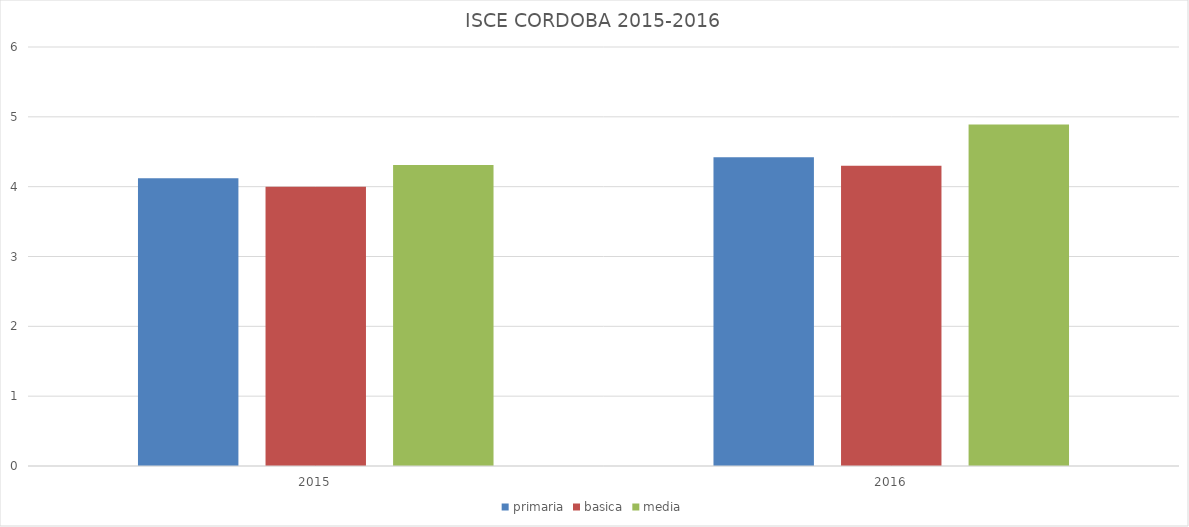
| Category | primaria | basica | media |
|---|---|---|---|
| 2015.0 | 4.12 | 4 | 4.31 |
| 2016.0 | 4.42 | 4.3 | 4.89 |